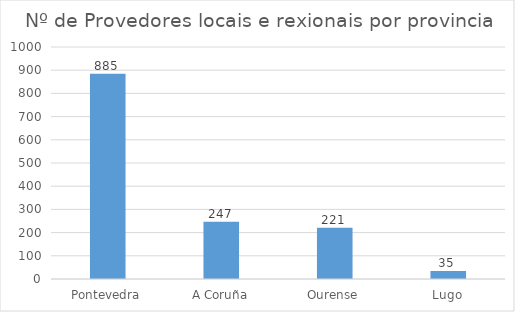
| Category | Series 0 |
|---|---|
| Pontevedra | 885 |
| A Coruña | 247 |
| Ourense | 221 |
| Lugo | 35 |